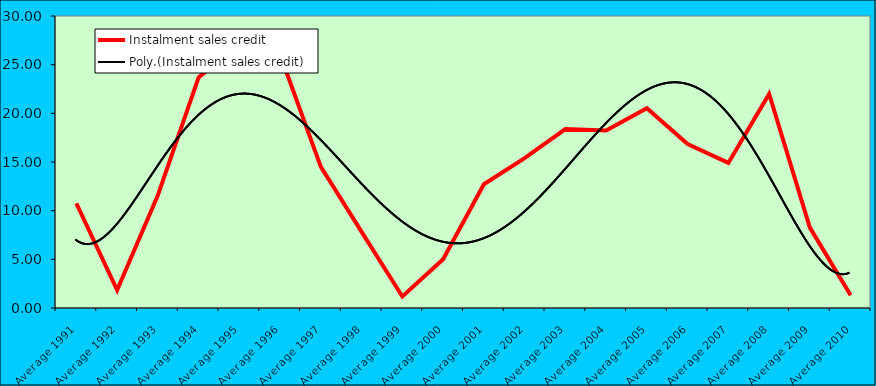
| Category | Instalment sales credit |
|---|---|
| Average 1991 | 10.755 |
| Average 1992 | 1.833 |
| Average 1993 | 11.59 |
| Average 1994 | 23.692 |
| Average 1995 | 27.178 |
| Average 1996 | 26.023 |
| Average 1997 | 14.501 |
| Average 1998 | 7.821 |
| Average 1999 | 1.181 |
| Average 2000 | 5.003 |
| Average 2001 | 12.717 |
| Average 2002 | 15.394 |
| Average 2003 | 18.388 |
| Average 2004 | 18.231 |
| Average 2005 | 20.519 |
| Average 2006 | 16.848 |
| Average 2007 | 14.907 |
| Average 2008 | 21.993 |
| Average 2009 | 8.259 |
| Average 2010 | 1.308 |